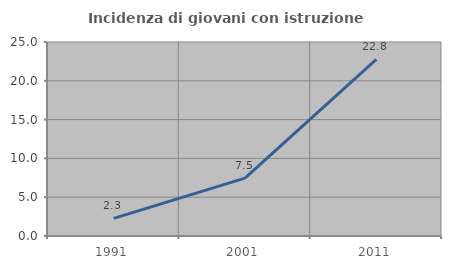
| Category | Incidenza di giovani con istruzione universitaria |
|---|---|
| 1991.0 | 2.273 |
| 2001.0 | 7.453 |
| 2011.0 | 22.759 |